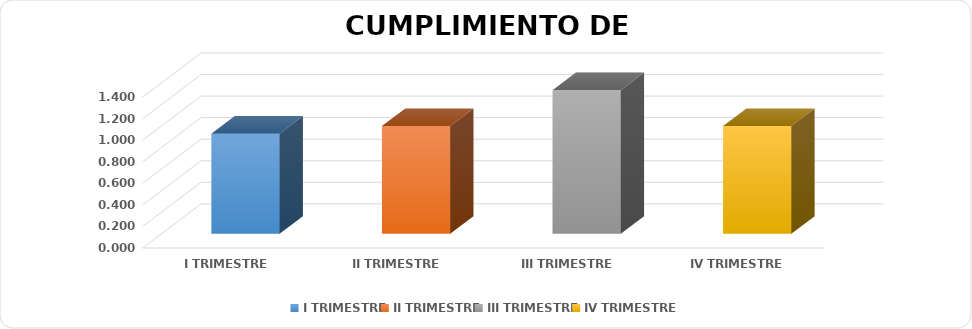
| Category | Series 0 |
|---|---|
| I TRIMESTRE | 0.929 |
| II TRIMESTRE | 1 |
| III TRIMESTRE | 1.333 |
| IV TRIMESTRE | 1 |